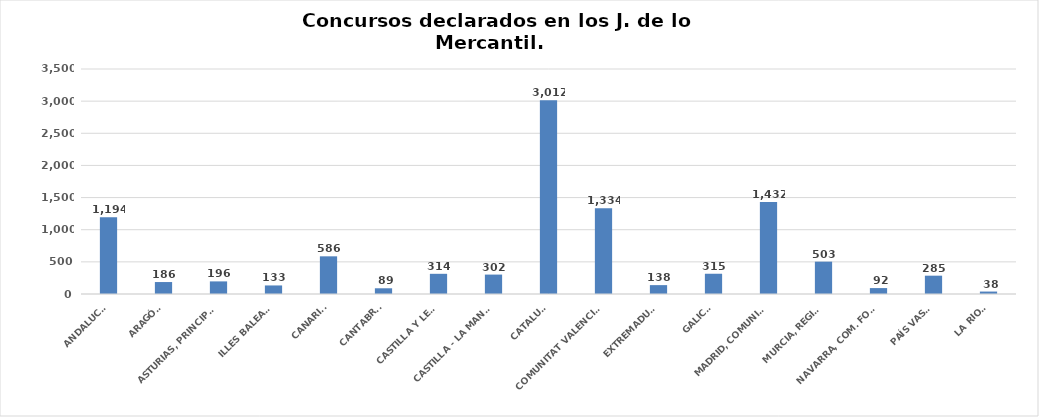
| Category | Series 0 |
|---|---|
| ANDALUCÍA | 1194 |
| ARAGÓN | 186 |
| ASTURIAS, PRINCIPADO | 196 |
| ILLES BALEARS | 133 |
| CANARIAS | 586 |
| CANTABRIA | 89 |
| CASTILLA Y LEÓN | 314 |
| CASTILLA - LA MANCHA | 302 |
| CATALUÑA | 3012 |
| COMUNITAT VALENCIANA | 1334 |
| EXTREMADURA | 138 |
| GALICIA | 315 |
| MADRID, COMUNIDAD | 1432 |
| MURCIA, REGIÓN | 503 |
| NAVARRA, COM. FORAL | 92 |
| PAÍS VASCO | 285 |
| LA RIOJA | 38 |